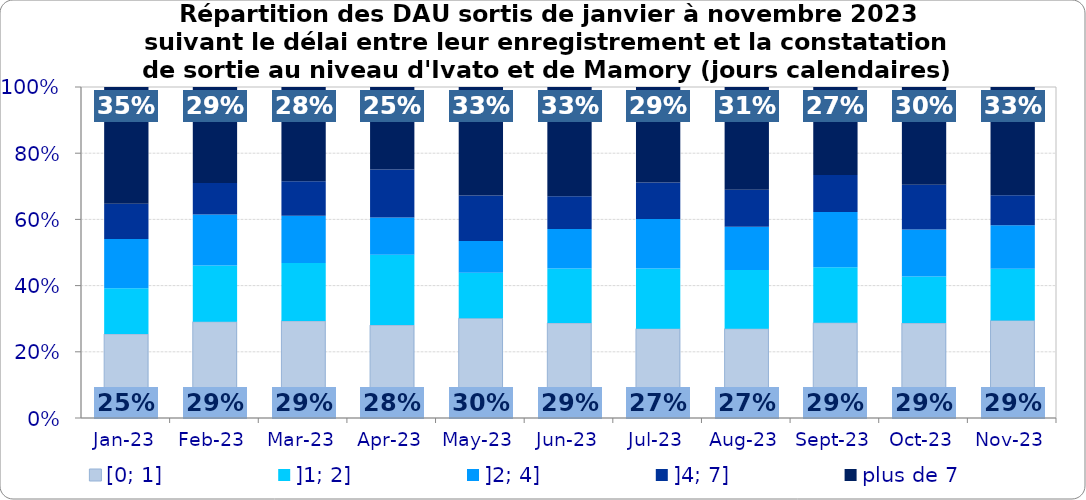
| Category | [0; 1] | ]1; 2] | ]2; 4] | ]4; 7] | plus de 7 |
|---|---|---|---|---|---|
| 2023-01-01 | 0.254 | 0.138 | 0.149 | 0.106 | 0.353 |
| 2023-02-01 | 0.291 | 0.17 | 0.155 | 0.095 | 0.29 |
| 2023-03-01 | 0.293 | 0.175 | 0.143 | 0.104 | 0.284 |
| 2023-04-01 | 0.281 | 0.213 | 0.113 | 0.145 | 0.249 |
| 2023-05-01 | 0.301 | 0.138 | 0.096 | 0.137 | 0.328 |
| 2023-06-01 | 0.287 | 0.165 | 0.119 | 0.099 | 0.33 |
| 2023-07-01 | 0.27 | 0.182 | 0.149 | 0.11 | 0.289 |
| 2023-08-01 | 0.27 | 0.177 | 0.13 | 0.112 | 0.31 |
| 2023-09-01 | 0.288 | 0.167 | 0.167 | 0.112 | 0.266 |
| 2023-10-01 | 0.287 | 0.141 | 0.142 | 0.135 | 0.296 |
| 2023-11-01 | 0.295 | 0.156 | 0.131 | 0.091 | 0.327 |